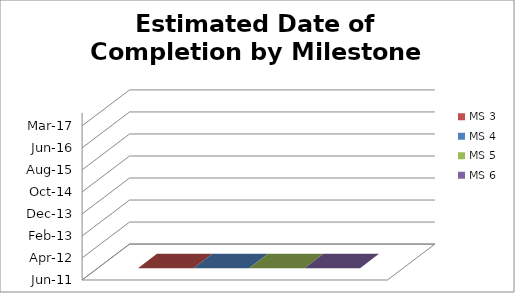
| Category | MS 3 | MS 4 | MS 5 | MS 6 |
|---|---|---|---|---|
| Completion Date | 0 | 0 | 0 | 0 |